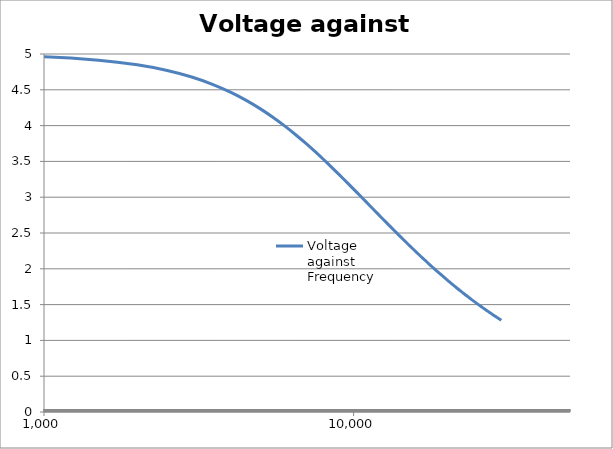
| Category | Voltage against Frequency |
|---|---|
| 1.0 | 5 |
| 500.0 | 4.99 |
| 1000.0 | 4.961 |
| 1500.0 | 4.913 |
| 2000.0 | 4.849 |
| 2500.0 | 4.77 |
| 3000.0 | 4.679 |
| 3500.0 | 4.577 |
| 4000.0 | 4.467 |
| 4500.0 | 4.352 |
| 5000.0 | 4.234 |
| 5500.0 | 4.113 |
| 6000.0 | 3.992 |
| 6500.0 | 3.872 |
| 7000.0 | 3.754 |
| 7500.0 | 3.639 |
| 8000.0 | 3.526 |
| 8500.0 | 3.417 |
| 9000.0 | 3.312 |
| 9500.0 | 3.211 |
| 10000.0 | 3.113 |
| 10500.0 | 3.02 |
| 11000.0 | 2.931 |
| 11500.0 | 2.845 |
| 12000.0 | 2.763 |
| 12500.0 | 2.685 |
| 13000.0 | 2.61 |
| 13500.0 | 2.539 |
| 14000.0 | 2.471 |
| 14500.0 | 2.406 |
| 15000.0 | 2.343 |
| 15500.0 | 2.284 |
| 16000.0 | 2.227 |
| 16500.0 | 2.172 |
| 17000.0 | 2.12 |
| 17500.0 | 2.07 |
| 18000.0 | 2.022 |
| 18500.0 | 1.976 |
| 19000.0 | 1.932 |
| 19500.0 | 1.889 |
| 20000.0 | 1.848 |
| 20500.0 | 1.809 |
| 21000.0 | 1.772 |
| 21500.0 | 1.736 |
| 22000.0 | 1.701 |
| 22500.0 | 1.667 |
| 23000.0 | 1.635 |
| 23500.0 | 1.604 |
| 24000.0 | 1.574 |
| 24500.0 | 1.545 |
| 25000.0 | 1.517 |
| 25500.0 | 1.489 |
| 26000.0 | 1.463 |
| 26500.0 | 1.438 |
| 27000.0 | 1.414 |
| 27500.0 | 1.39 |
| 28000.0 | 1.367 |
| 28500.0 | 1.345 |
| 29000.0 | 1.323 |
| 29500.0 | 1.302 |
| 30000.0 | 1.282 |